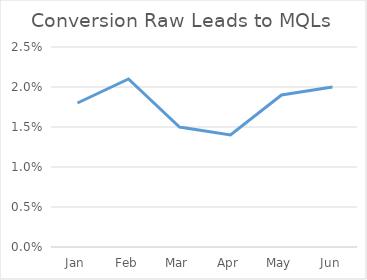
| Category | Conversion Raw Leads to MQLs |
|---|---|
| Jan | 0.018 |
| Feb | 0.021 |
| Mar | 0.015 |
| Apr | 0.014 |
| May | 0.019 |
| Jun | 0.02 |